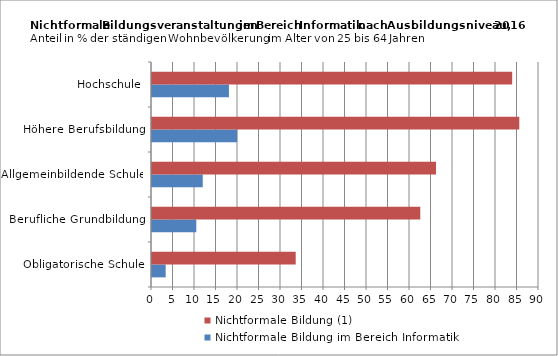
| Category | Nichtformale Bildung im Bereich Informatik | Nichtformale Bildung (1) |
|---|---|---|
| Obligatorische Schule | 3.183 | 33.418 |
| Berufliche Grundbildung | 10.302 | 62.39 |
| Allgemeinbildende Schule | 11.803 | 66.054 |
| Höhere Berufsbildung | 19.814 | 85.415 |
| Hochschule | 17.893 | 83.763 |